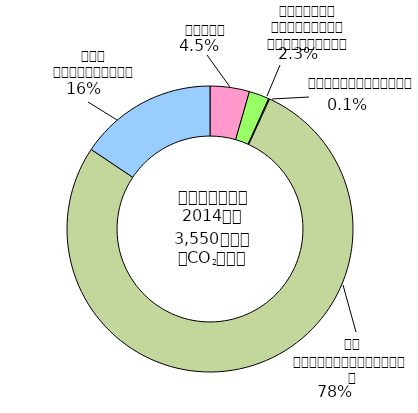
| Category | Series 0 |
|---|---|
| 0 | 0.045 |
| 1 | 0.023 |
| 2 | 0.001 |
| 3 | 0.775 |
| 4 | 0.156 |